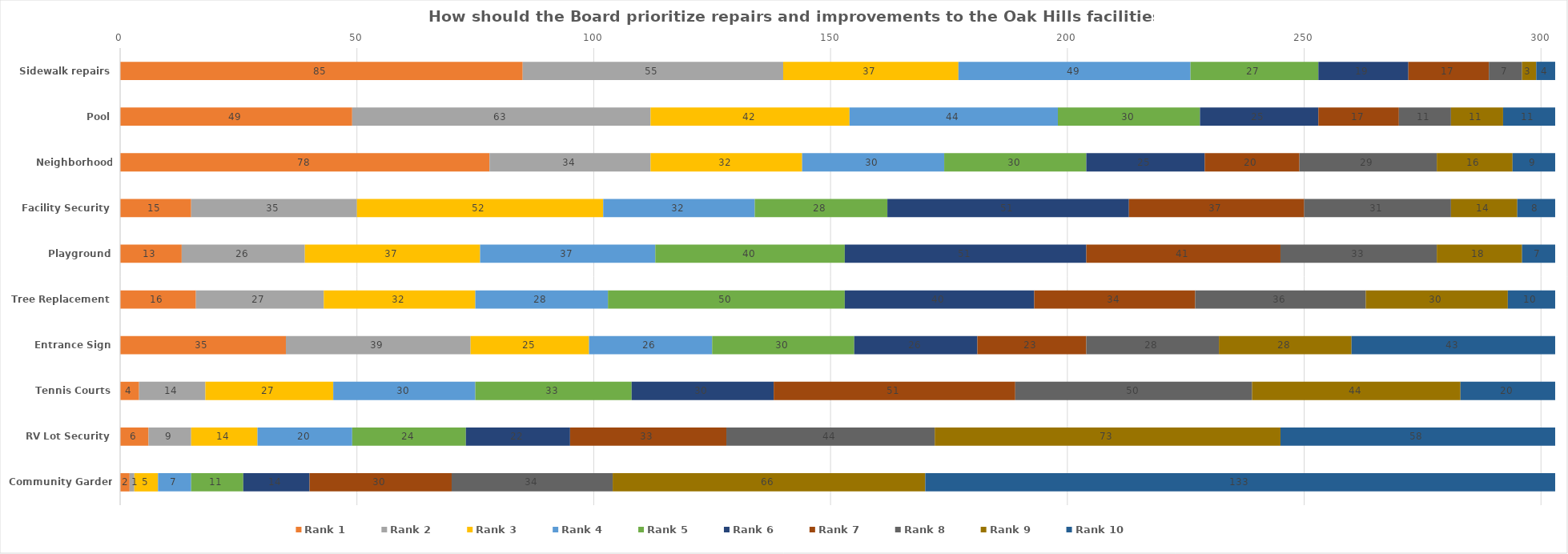
| Category | Rank 1 | Rank 2 | Rank 3 | Rank 4 | Rank 5 | Rank 6 | Rank 7 | Rank 8 | Rank 9 | Rank 10 |
|---|---|---|---|---|---|---|---|---|---|---|
| Sidewalk repairs | 85 | 55 | 37 | 49 | 27 | 19 | 17 | 7 | 3 | 4 |
| Pool | 49 | 63 | 42 | 44 | 30 | 25 | 17 | 11 | 11 | 11 |
| Neighborhood Safety | 78 | 34 | 32 | 30 | 30 | 25 | 20 | 29 | 16 | 9 |
| Facility Security | 15 | 35 | 52 | 32 | 28 | 51 | 37 | 31 | 14 | 8 |
| Playground | 13 | 26 | 37 | 37 | 40 | 51 | 41 | 33 | 18 | 7 |
| Tree Replacement | 16 | 27 | 32 | 28 | 50 | 40 | 34 | 36 | 30 | 10 |
| Entrance Sign | 35 | 39 | 25 | 26 | 30 | 26 | 23 | 28 | 28 | 43 |
| Tennis Courts | 4 | 14 | 27 | 30 | 33 | 30 | 51 | 50 | 44 | 20 |
| RV Lot Security | 6 | 9 | 14 | 20 | 24 | 22 | 33 | 44 | 73 | 58 |
| Community Garden | 2 | 1 | 5 | 7 | 11 | 14 | 30 | 34 | 66 | 133 |